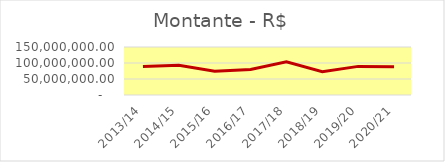
| Category | Montante |
|---|---|
| 2013/14 | 88810516.98 |
| 2014/15 | 92679574.14 |
| 2015/16 | 74532883.26 |
| 2016/17 | 79814158.29 |
| 2017/18 | 103722222.75 |
| 2018/19 | 72716903.09 |
| 2019/20 | 89449080.24 |
| 2020/21 | 88553251.42 |